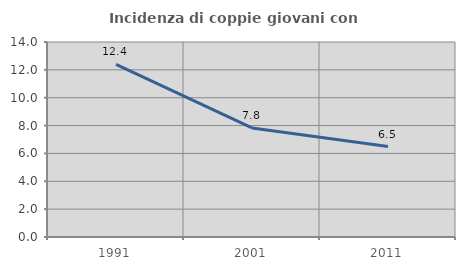
| Category | Incidenza di coppie giovani con figli |
|---|---|
| 1991.0 | 12.392 |
| 2001.0 | 7.831 |
| 2011.0 | 6.491 |